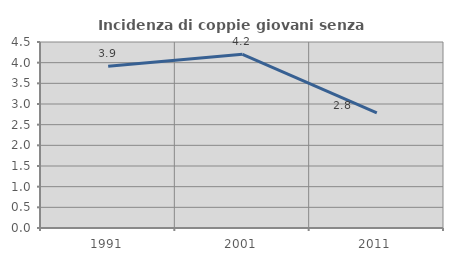
| Category | Incidenza di coppie giovani senza figli |
|---|---|
| 1991.0 | 3.915 |
| 2001.0 | 4.202 |
| 2011.0 | 2.787 |